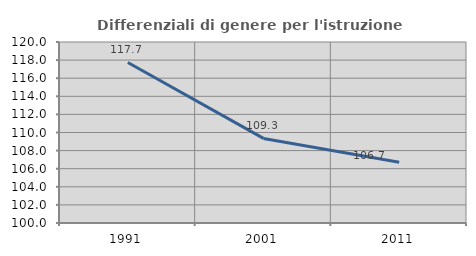
| Category | Differenziali di genere per l'istruzione superiore |
|---|---|
| 1991.0 | 117.74 |
| 2001.0 | 109.346 |
| 2011.0 | 106.719 |